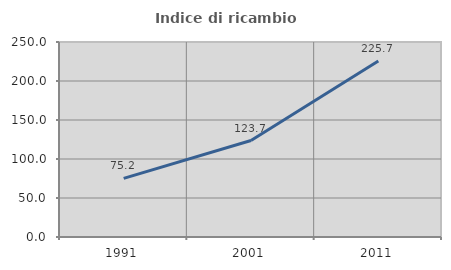
| Category | Indice di ricambio occupazionale  |
|---|---|
| 1991.0 | 75.194 |
| 2001.0 | 123.669 |
| 2011.0 | 225.74 |